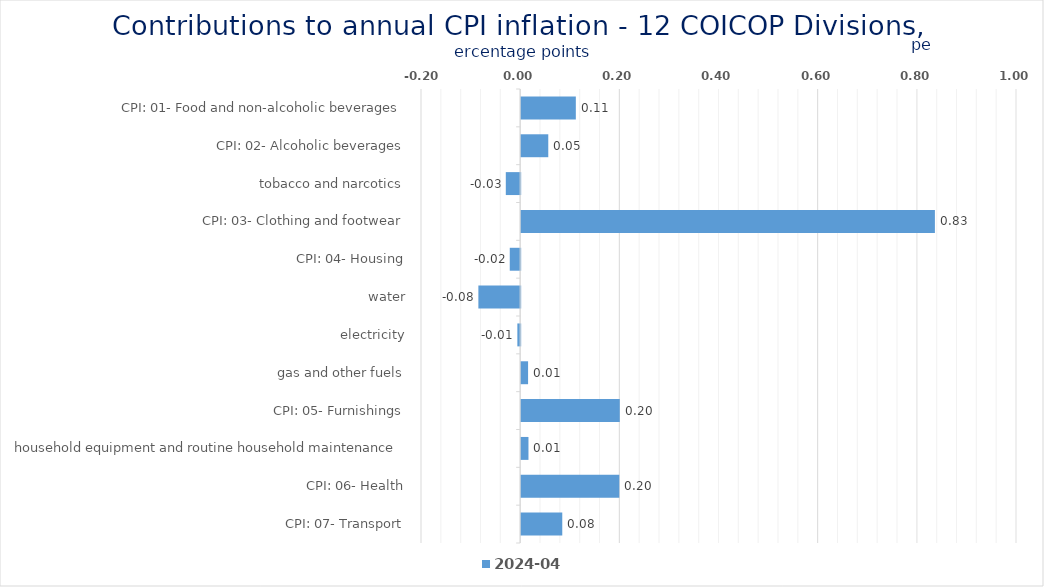
| Category | 2024-04 |
|---|---|
| CPI: 01- Food and non-alcoholic beverages | 0.11 |
| CPI: 02- Alcoholic beverages, tobacco and narcotics | 0.055 |
| CPI: 03- Clothing and footwear | -0.029 |
| CPI: 04- Housing, water, electricity, gas and other fuels | 0.834 |
| CPI: 05- Furnishings, household equipment and routine household maintenance | -0.021 |
| CPI: 06- Health | -0.084 |
| CPI: 07- Transport | -0.006 |
| CPI: 08- Communication | 0.014 |
| CPI: 09- Recreation and culture | 0.199 |
| CPI: 10- Education | 0.015 |
| CPI: 11- Restaurants and hotels | 0.198 |
| CPI: 12- Miscellaneous goods and services | 0.083 |